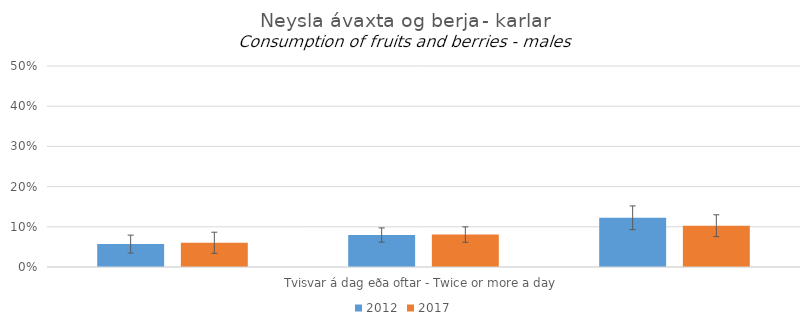
| Category | 2012 | 2017 |
|---|---|---|
| 0 | 0.057 | 0.06 |
| 1 | 0.08 | 0.081 |
| 2 | 0.122 | 0.103 |